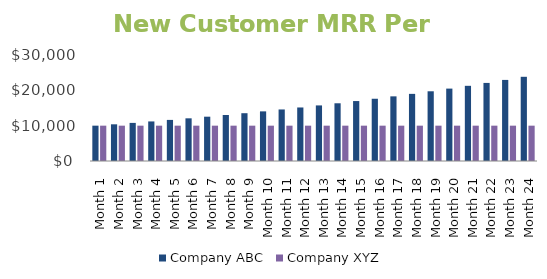
| Category | Company ABC | Company XYZ |
|---|---|---|
| 1.0 | 10000 | 10000 |
| 2.0 | 10384.795 | 10000 |
| 3.0 | 10784.396 | 10000 |
| 4.0 | 11199.375 | 10000 |
| 5.0 | 11630.321 | 10000 |
| 6.0 | 12077.85 | 10000 |
| 7.0 | 12542.599 | 10000 |
| 8.0 | 13025.232 | 10000 |
| 9.0 | 13526.436 | 10000 |
| 10.0 | 14046.926 | 10000 |
| 11.0 | 14587.445 | 10000 |
| 12.0 | 15148.762 | 10000 |
| 13.0 | 15731.679 | 10000 |
| 14.0 | 16337.026 | 10000 |
| 15.0 | 16965.666 | 10000 |
| 16.0 | 17618.496 | 10000 |
| 17.0 | 18296.447 | 10000 |
| 18.0 | 19000.485 | 10000 |
| 19.0 | 19731.614 | 10000 |
| 20.0 | 20490.876 | 10000 |
| 21.0 | 21279.355 | 10000 |
| 22.0 | 22098.174 | 10000 |
| 23.0 | 22948.5 | 10000 |
| 24.0 | 23831.547 | 10000 |